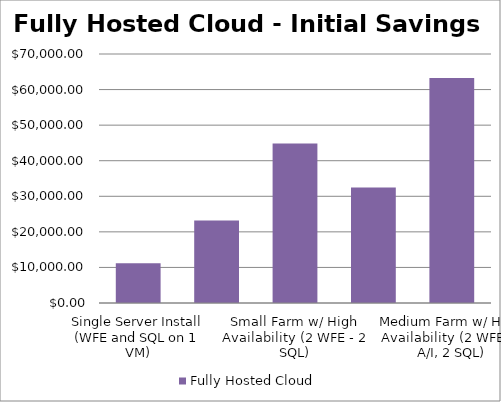
| Category | Fully Hosted Cloud |
|---|---|
| Single Server Install (WFE and SQL on 1 VM) | 11144.036 |
| Small Farm - Two Server Install (WFE and SQL) | 23188.474 |
| Small Farm w/ High Availability (2 WFE - 2 SQL) | 44854.777 |
| Medium Farm (1 WFE, 1 App/Index, 1 SQL) | 32462.422 |
| Medium Farm w/ High Availability (2 WFE, 2 A/I, 2 SQL) | 63286.827 |